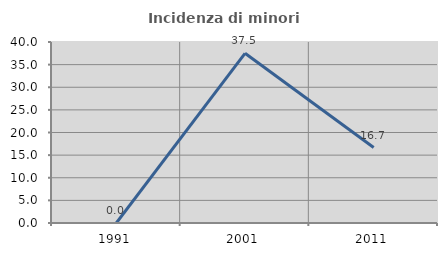
| Category | Incidenza di minori stranieri |
|---|---|
| 1991.0 | 0 |
| 2001.0 | 37.5 |
| 2011.0 | 16.667 |